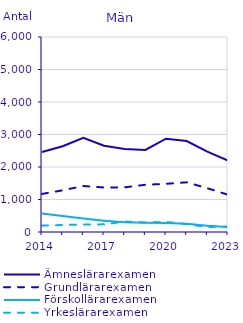
| Category | Ämneslärarexamen                                   | Grundlärarexamen                                   | Förskollärarexamen                                 | Yrkeslärarexamen                                   |
|---|---|---|---|---|
| 2014 | 2460 | 1171 | 569 | 196 |
| 2015 | 2637 | 1283 | 490 | 216 |
| 2016 | 2901 | 1415 | 415 | 231 |
| 2017 | 2654 | 1370 | 349 | 235 |
| 2018 | 2552 | 1374 | 297 | 322 |
| 2019 | 2526 | 1453 | 283 | 290 |
| 2020 | 2872 | 1483 | 279 | 310 |
| 2021 | 2800 | 1529 | 253 | 243 |
| 2022 | 2471 | 1347 | 189 | 154 |
| 2023 | 2197 | 1147 | 156 | 167 |